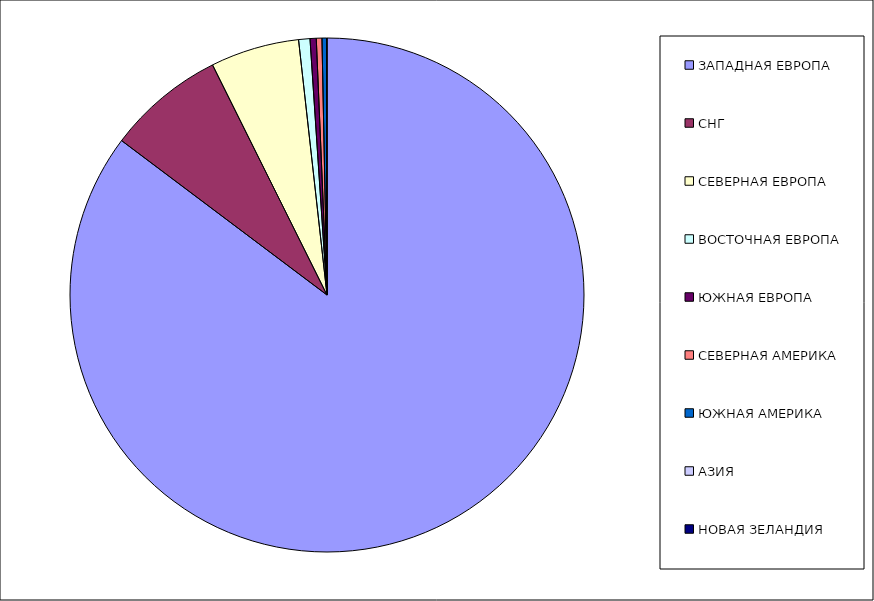
| Category | Оборот |
|---|---|
| ЗАПАДНАЯ ЕВРОПА | 0.853 |
| СНГ | 0.074 |
| СЕВЕРНАЯ ЕВРОПА | 0.056 |
| ВОСТОЧНАЯ ЕВРОПА | 0.007 |
| ЮЖНАЯ ЕВРОПА | 0.004 |
| СЕВЕРНАЯ АМЕРИКА | 0.004 |
| ЮЖНАЯ АМЕРИКА | 0.003 |
| АЗИЯ | 0 |
| НОВАЯ ЗЕЛАНДИЯ | 0 |